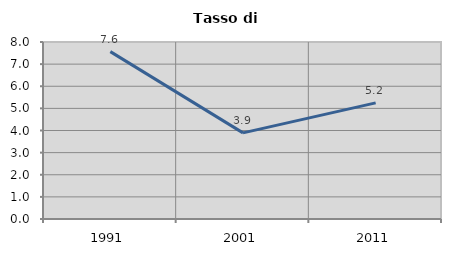
| Category | Tasso di disoccupazione   |
|---|---|
| 1991.0 | 7.566 |
| 2001.0 | 3.893 |
| 2011.0 | 5.25 |